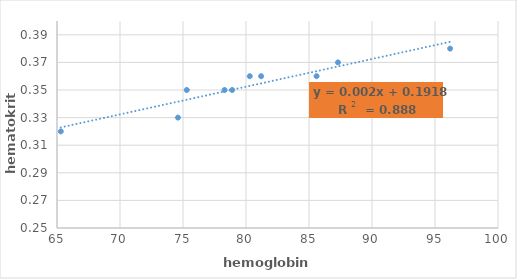
| Category | hematokrit (l/l) |
|---|---|
| 87.3 | 0.37 |
| 78.3 | 0.35 |
| 65.3 | 0.32 |
| 78.9 | 0.35 |
| 81.2 | 0.36 |
| 75.3 | 0.35 |
| 96.2 | 0.38 |
| 74.6 | 0.33 |
| 85.6 | 0.36 |
| 80.3 | 0.36 |